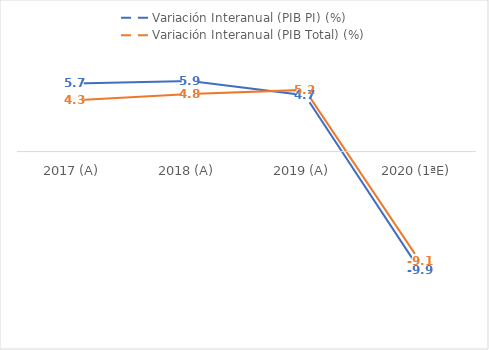
| Category | Variación Interanual (PIB PI) (%) | Variación Interanual (PIB Total) (%) |
|---|---|---|
| 2017 (A) | 5.702 | 4.289 |
| 2018 (A) | 5.916 | 4.812 |
| 2019 (A) | 4.716 | 5.165 |
| 2020 (1ªE) | -9.876 | -9.141 |